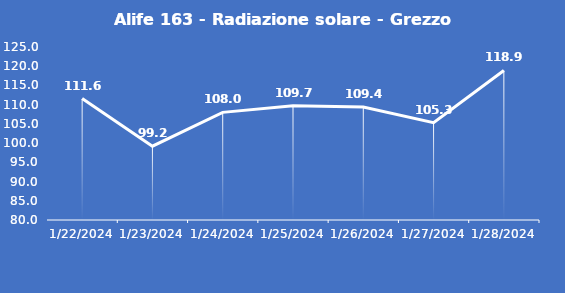
| Category | Alife 163 - Radiazione solare - Grezzo (W/m2) |
|---|---|
| 1/22/24 | 111.6 |
| 1/23/24 | 99.2 |
| 1/24/24 | 108 |
| 1/25/24 | 109.7 |
| 1/26/24 | 109.4 |
| 1/27/24 | 105.3 |
| 1/28/24 | 118.9 |